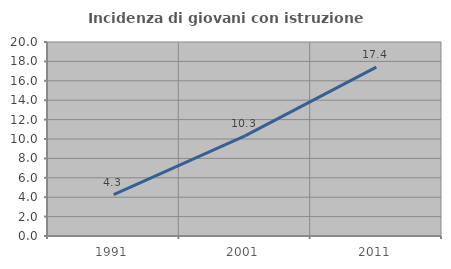
| Category | Incidenza di giovani con istruzione universitaria |
|---|---|
| 1991.0 | 4.276 |
| 2001.0 | 10.327 |
| 2011.0 | 17.403 |